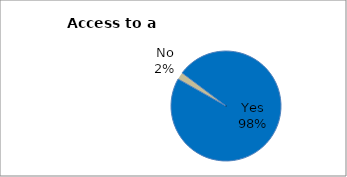
| Category | Series 0 |
|---|---|
| Yes | 97.899 |
| No | 2.101 |